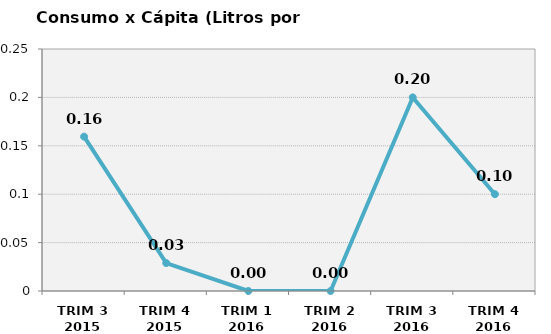
| Category | Consumo x Cápita (Litros por persona) |
|---|---|
|  TRIM 3 2015  | 0.159 |
|  TRIM 4 2015  | 0.029 |
|  TRIM 1 2016  | 0 |
|  TRIM 2 2016  | 0 |
|  TRIM 3 2016  | 0.2 |
|  TRIM 4 2016  | 0.1 |